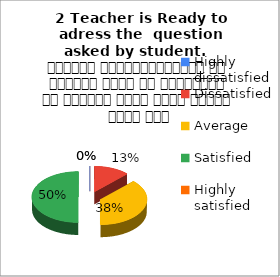
| Category | 2 Teacher is Ready to adress the  question asked by student.   शिक्षक विद्यार्थियों के द्वारा पूछे गए प्रश्नों का समाधान करने हेतु तत्पर रहते हैं |
|---|---|
| Highly dissatisfied | 0 |
| Dissatisfied | 1 |
| Average | 3 |
| Satisfied | 4 |
| Highly satisfied | 0 |